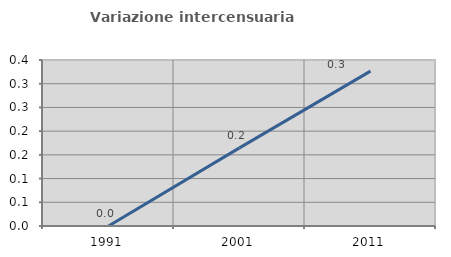
| Category | Variazione intercensuaria annua |
|---|---|
| 1991.0 | 0 |
| 2001.0 | 0.165 |
| 2011.0 | 0.327 |